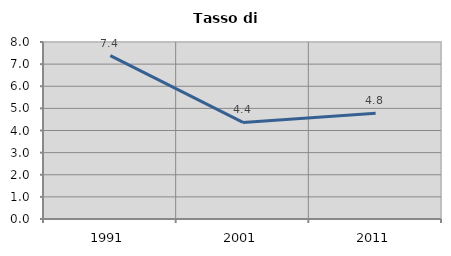
| Category | Tasso di disoccupazione   |
|---|---|
| 1991.0 | 7.384 |
| 2001.0 | 4.365 |
| 2011.0 | 4.782 |